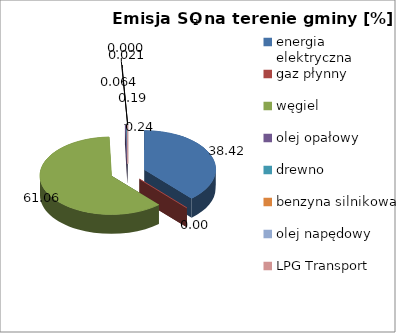
| Category | energia elektryczna gaz płynny węgiel olej opałowy drewno benzyna silnikowa olej napędowy LPG Transport |
|---|---|
| energia elektryczna | 38.424 |
| gaz płynny | 0.002 |
| węgiel | 61.057 |
| olej opałowy | 0.238 |
| drewno | 0.194 |
| benzyna silnikowa | 0.064 |
| olej napędowy | 0.021 |
| LPG Transport | 0 |